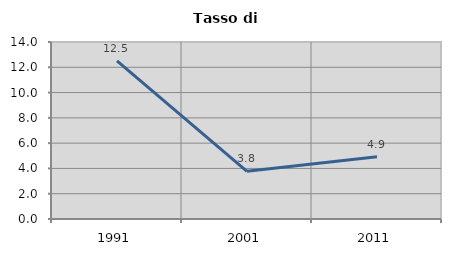
| Category | Tasso di disoccupazione   |
|---|---|
| 1991.0 | 12.5 |
| 2001.0 | 3.774 |
| 2011.0 | 4.926 |